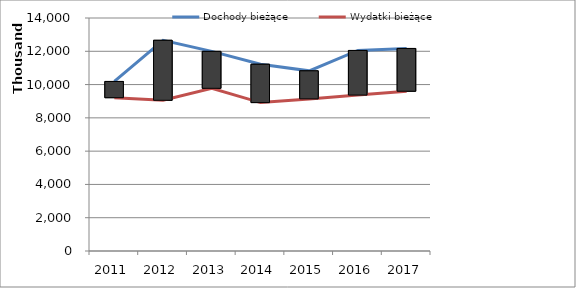
| Category | Dochody bieżące | Wydatki bieżące |
|---|---|---|
| 2011.0 | 10187163.27 | 9211865.66 |
| 2012.0 | 12660364.54 | 9055670.43 |
| 2013.0 | 11995164 | 9775844 |
| 2014.0 | 11221741 | 8917188.81 |
| 2015.0 | 10825000 | 9140000 |
| 2016.0 | 12050000 | 9368000 |
| 2017.0 | 12170000 | 9600000 |